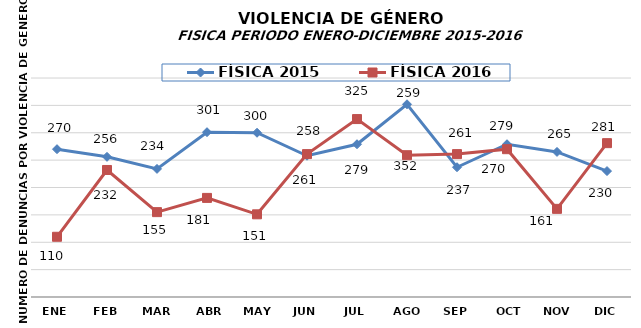
| Category | FÍSICA 2015 | FÍSICA 2016 |
|---|---|---|
| ENE | 270 | 110 |
| FEB | 256 | 232 |
| MAR | 234 | 155 |
| ABR | 301 | 181 |
| MAY | 300 | 151 |
| JUN | 258 | 261 |
| JUL | 279 | 325 |
| AGO | 352 | 259 |
| SEP | 237 | 261 |
| OCT | 279 | 270 |
| NOV | 265 | 161 |
| DIC | 230 | 281 |